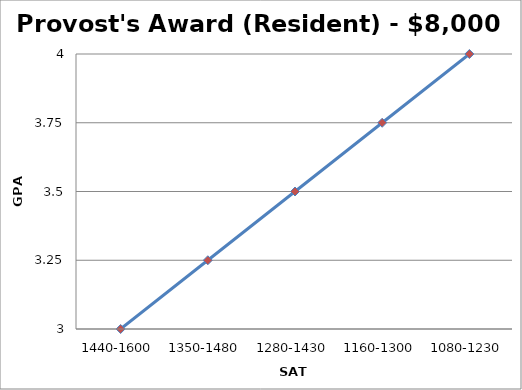
| Category | Provost's Award-$7500 |
|---|---|
| 1440-1600 | 3 |
| 1350-1480 | 3.25 |
| 1280-1430 | 3.5 |
| 1160-1300 | 3.75 |
| 1080-1230 | 4 |